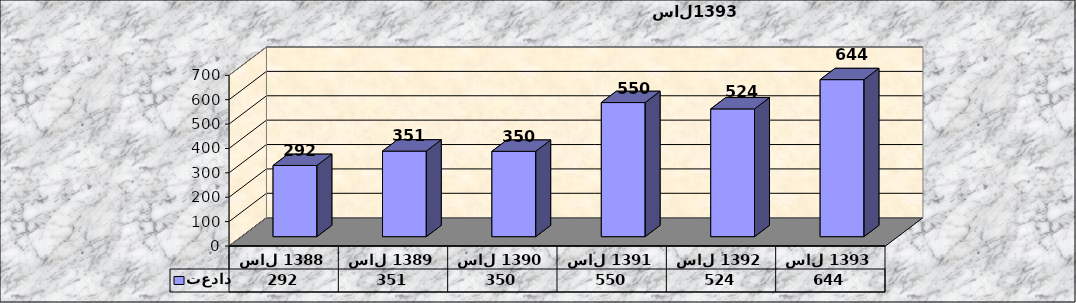
| Category | تعداد |
|---|---|
| سال 1388 | 292 |
| سال 1389 | 351 |
| سال 1390 | 350 |
| سال 1391 | 550 |
| سال 1392 | 524 |
| سال 1393 | 644 |